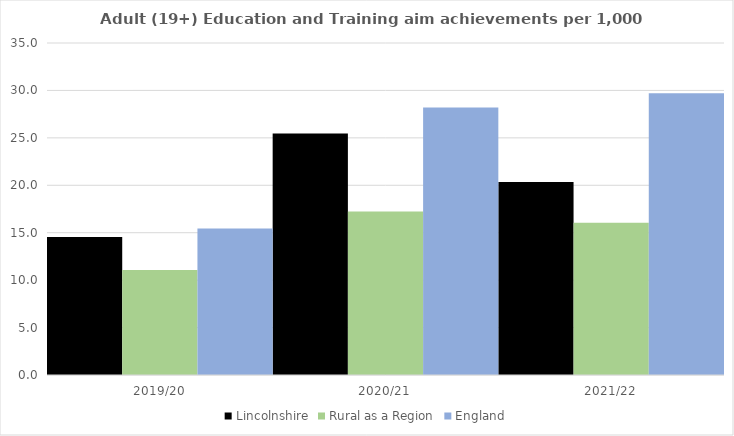
| Category | Lincolnshire | Rural as a Region | England |
|---|---|---|---|
| 2019/20 | 14.552 | 11.081 | 15.446 |
| 2020/21 | 25.47 | 17.224 | 28.211 |
| 2021/22 | 20.359 | 16.063 | 29.711 |